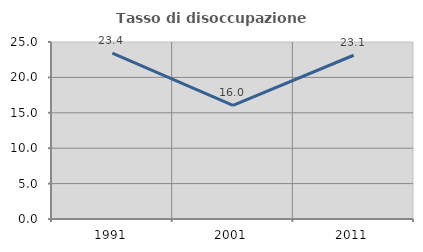
| Category | Tasso di disoccupazione giovanile  |
|---|---|
| 1991.0 | 23.421 |
| 2001.0 | 16.038 |
| 2011.0 | 23.129 |